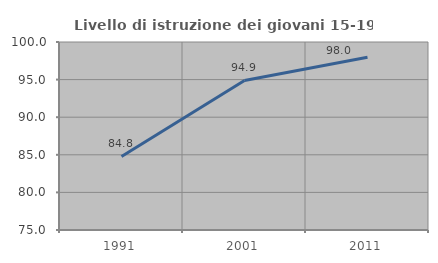
| Category | Livello di istruzione dei giovani 15-19 anni |
|---|---|
| 1991.0 | 84.787 |
| 2001.0 | 94.888 |
| 2011.0 | 97.973 |